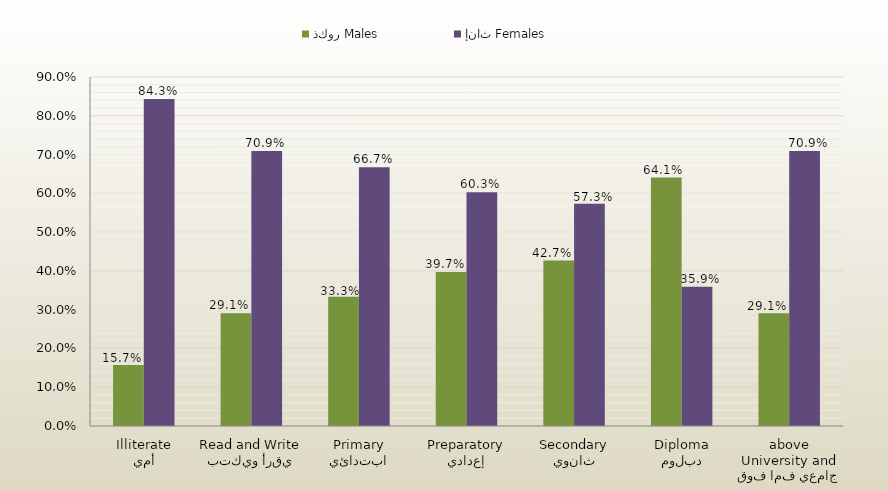
| Category | ذكور Males | إناث Females |
|---|---|---|
| أمي
Illiterate | 0.157 | 0.843 |
| يقرأ ويكتب
Read and Write | 0.291 | 0.709 |
| ابتدائي
Primary | 0.333 | 0.667 |
| إعدادي
Preparatory | 0.397 | 0.603 |
| ثانوي
Secondary | 0.427 | 0.573 |
| دبلوم
Diploma | 0.641 | 0.359 |
| جامعي فما فوق
University and above | 0.291 | 0.709 |